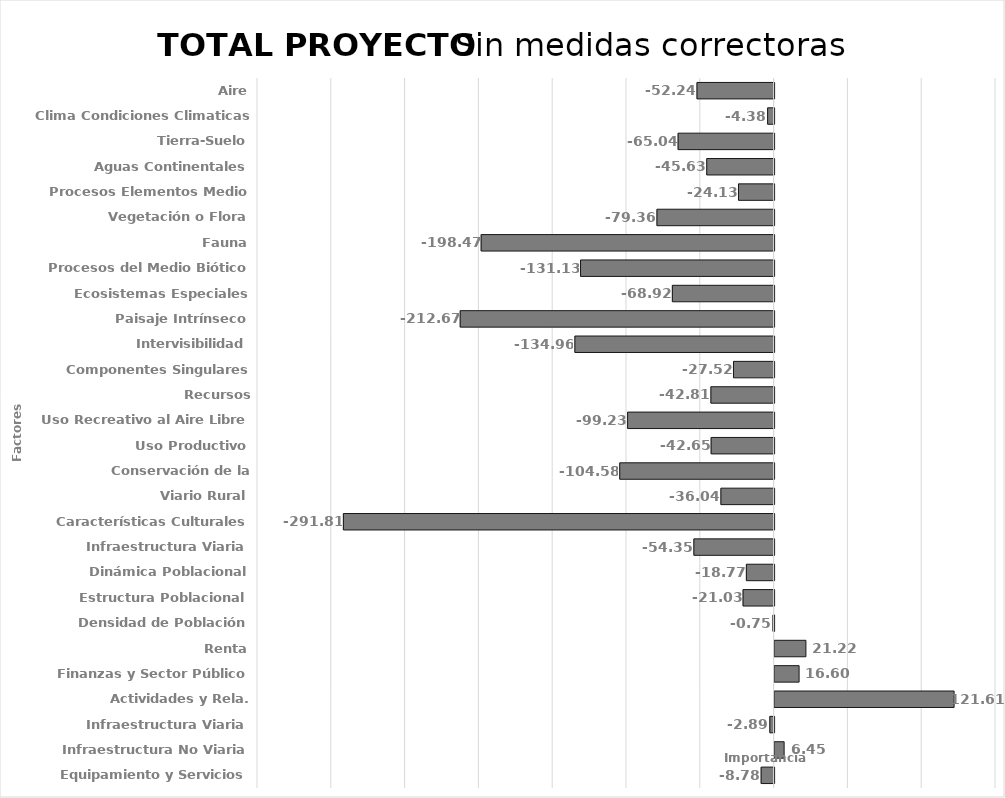
| Category | Series 0 |
|---|---|
| Aire | -52.243 |
| Clima Condiciones Climaticas | -4.378 |
| Tierra-Suelo | -65.036 |
| Aguas Continentales | -45.627 |
| Procesos Elementos Medio | -24.127 |
| Vegetación o Flora | -79.364 |
| Fauna | -198.473 |
| Procesos del Medio Biótico | -131.134 |
| Ecosistemas Especiales | -68.921 |
| Paisaje Intrínseco | -212.672 |
| Intervisibilidad | -134.958 |
| Componentes Singulares Paisaje | -27.518 |
| Recursos Científico-Culturales | -42.806 |
| Uso Recreativo al Aire Libre | -99.228 |
| Uso Productivo | -42.651 |
| Conservación de la Naturaleza | -104.581 |
| Viario Rural | -36.036 |
| Características Culturales | -291.809 |
| Infraestructura Viaria | -54.347 |
| Dinámica Poblacional | -18.775 |
| Estructura Poblacional | -21.028 |
| Densidad de Población | -0.751 |
| Renta | 21.217 |
| Finanzas y Sector Público | 16.6 |
| Actividades y Rela. Económicas | 121.611 |
| Infraestructura Viaria | -2.888 |
| Infraestructura No Viaria | 6.455 |
| Equipamiento y Servicios | -8.776 |